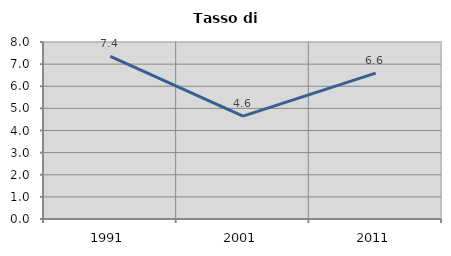
| Category | Tasso di disoccupazione   |
|---|---|
| 1991.0 | 7.354 |
| 2001.0 | 4.65 |
| 2011.0 | 6.591 |